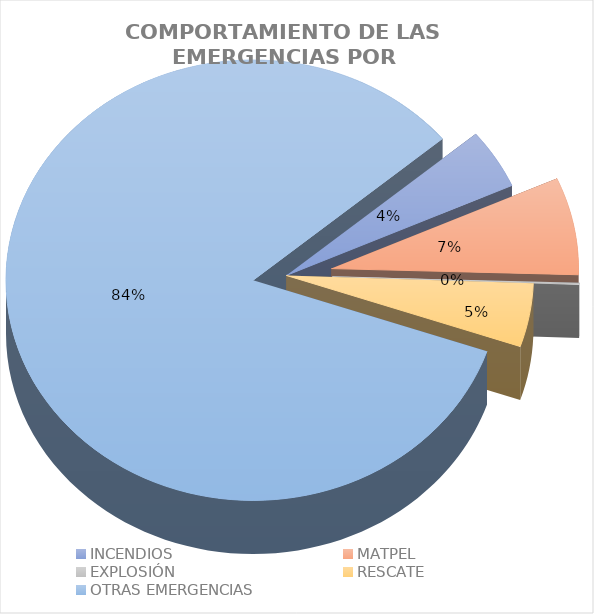
| Category | Incidentes |
|---|---|
| INCENDIOS | 0.044 |
| MATPEL | 0.071 |
| EXPLOSIÓN | 0.001 |
| RESCATE | 0.047 |
| OTRAS EMERGENCIAS | 0.837 |